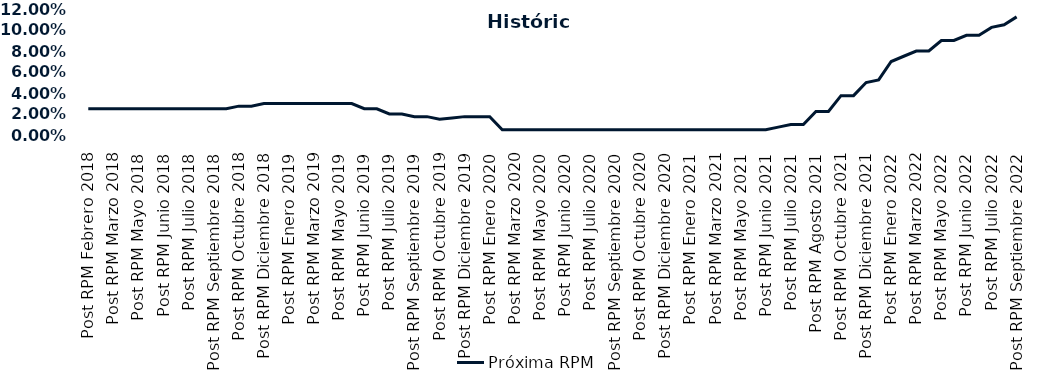
| Category | Próxima RPM |
|---|---|
| Post RPM Febrero 2018 | 0.025 |
| Pre RPM Marzo 2018 | 0.025 |
| Post RPM Marzo 2018 | 0.025 |
| Pre RPM Mayo 2018 | 0.025 |
| Post RPM Mayo 2018 | 0.025 |
| Pre RPM Junio 2018 | 0.025 |
| Post RPM Junio 2018 | 0.025 |
| Pre RPM Julio 2018 | 0.025 |
| Post RPM Julio 2018 | 0.025 |
| Pre RPM Septiembre 2018 | 0.025 |
| Post RPM Septiembre 2018 | 0.025 |
| Pre RPM Octubre 2018 | 0.025 |
| Post RPM Octubre 2018 | 0.028 |
| Pre RPM Diciembre 2018 | 0.028 |
| Post RPM Diciembre 2018 | 0.03 |
| Pre RPM Enero 2019 | 0.03 |
| Post RPM Enero 2019 | 0.03 |
| Pre RPM Marzo 2019 | 0.03 |
| Post RPM Marzo 2019 | 0.03 |
| Pre RPM Mayo 2019 | 0.03 |
| Post RPM Mayo 2019 | 0.03 |
| Pre RPM Junio 2019 | 0.03 |
| Post RPM Junio 2019 | 0.025 |
| Pre RPM Julio 2019 | 0.025 |
| Post RPM Julio 2019 | 0.02 |
| Pre RPM Septiembre 2019 | 0.02 |
| Post RPM Septiembre 2019 | 0.018 |
| Pre RPM Octubre 2019 | 0.018 |
| Post RPM Octubre 2019 | 0.015 |
| Pre RPM Diciembre 2019 | 0.016 |
| Post RPM Diciembre 2019 | 0.018 |
| Pre RPM Enero 2020 | 0.018 |
| Post RPM Enero 2020 | 0.018 |
| Pre RPM Marzo 2020 | 0.005 |
| Post RPM Marzo 2020 | 0.005 |
| Pre RPM Mayo 2020 | 0.005 |
| Post RPM Mayo 2020 | 0.005 |
| Pre RPM Junio 2020 | 0.005 |
| Post RPM Junio 2020 | 0.005 |
| Pre RPM Julio 2020 | 0.005 |
| Post RPM Julio 2020 | 0.005 |
| Pre RPM Septiembre 2020 | 0.005 |
| Post RPM Septiembre 2020 | 0.005 |
| Pre RPM Octubre 2020 | 0.005 |
| Post RPM Octubre 2020 | 0.005 |
| Pre RPM Diciembre 2020 | 0.005 |
| Post RPM Diciembre 2020 | 0.005 |
| Pre RPM Enero 2021 | 0.005 |
| Post RPM Enero 2021 | 0.005 |
| Pre RPM Marzo 2021 | 0.005 |
| Post RPM Marzo 2021 | 0.005 |
| Pre RPM Mayo 2021 | 0.005 |
| Post RPM Mayo 2021 | 0.005 |
| Pre RPM Junio 2021 | 0.005 |
| Post RPM Junio 2021 | 0.005 |
| Pre RPM Julio 2021 | 0.008 |
| Post RPM Julio 2021 | 0.01 |
| Pre RPM Agosto 2021 | 0.01 |
| Post RPM Agosto 2021 | 0.022 |
| Pre RPM Octubre 2021 | 0.022 |
| Post RPM Octubre 2021 | 0.038 |
| Pre RPM Diciembre 2021 | 0.038 |
| Post RPM Diciembre 2021 | 0.05 |
| Pre RPM Enero 2022 | 0.052 |
| Post RPM Enero 2022 | 0.07 |
| Pre RPM Marzo 2022 | 0.075 |
| Post RPM Marzo 2022 | 0.08 |
| Pre RPM Mayo 2022 | 0.08 |
| Post RPM Mayo 2022 | 0.09 |
| Pre RPM Junio 2022 | 0.09 |
| Post RPM Junio 2022 | 0.095 |
| Pre RPM Julio 2022 | 0.095 |
| Post RPM Julio 2022 | 0.102 |
| Pre RPM Septiembre 2022 | 0.105 |
| Post RPM Septiembre 2022 | 0.112 |